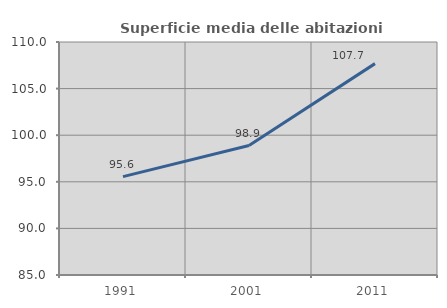
| Category | Superficie media delle abitazioni occupate |
|---|---|
| 1991.0 | 95.555 |
| 2001.0 | 98.89 |
| 2011.0 | 107.68 |